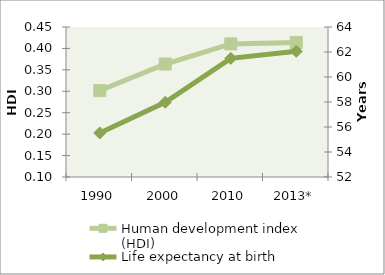
| Category | Human development index (HDI) |
|---|---|
| 1990 | 0.301 |
| 2000 | 0.364 |
| 2010 | 0.411 |
| 2013* | 0.414 |